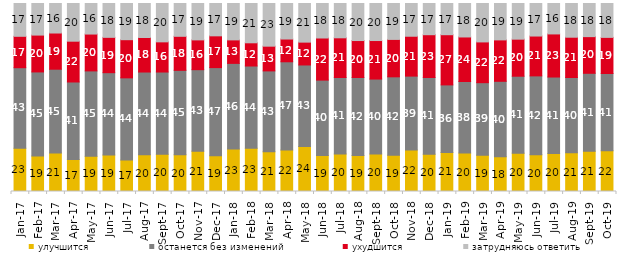
| Category | улучшится | останется без изменений | ухудшится | затрудняюсь ответить |
|---|---|---|---|---|
| 2017-01-01 | 23 | 42.85 | 16.7 | 17.45 |
| 2017-02-01 | 18.85 | 44.75 | 19.6 | 16.8 |
| 2017-03-01 | 20.5 | 44.55 | 19.25 | 15.7 |
| 2017-04-01 | 17 | 41.25 | 21.7 | 20.05 |
| 2017-05-01 | 18.7 | 45.45 | 19.6 | 16.25 |
| 2017-06-01 | 19.4 | 43.8 | 18.8 | 18 |
| 2017-07-01 | 16.7 | 43.75 | 20.3 | 19.25 |
| 2017-08-01 | 19.5 | 44.05 | 18.35 | 18.1 |
| 2017-09-01 | 19.8 | 43.75 | 16.05 | 20.4 |
| 2017-10-01 | 19.55 | 44.9 | 18.1 | 17.45 |
| 2017-11-01 | 21.45 | 43.35 | 15.85 | 19.35 |
| 2017-12-01 | 18.95 | 46.95 | 16.9 | 17.2 |
| 2018-01-01 | 22.55 | 45.6 | 12.5 | 19.35 |
| 2018-02-01 | 23 | 43.75 | 12.35 | 20.9 |
| 2018-03-01 | 21.15 | 43 | 13.15 | 22.7 |
| 2018-04-01 | 22.05 | 46.95 | 12.1 | 18.9 |
| 2018-05-01 | 23.95 | 43.35 | 12.15 | 20.55 |
| 2018-06-01 | 19.15 | 40.1 | 22.4 | 18.35 |
| 2018-07-01 | 19.95 | 40.7 | 21.1 | 18.25 |
| 2018-08-01 | 19.15 | 41.5 | 19.65 | 19.7 |
| 2018-09-01 | 19.95 | 39.85 | 20.5 | 19.7 |
| 2018-10-01 | 19.3 | 41.7 | 19.9 | 19.1 |
| 2018-11-01 | 22.056 | 39.321 | 21.208 | 17.415 |
| 2018-12-01 | 19.8 | 40.85 | 22.75 | 16.6 |
| 2019-01-01 | 20.75 | 35.95 | 26.7 | 16.6 |
| 2019-02-01 | 20.45 | 38.05 | 23.7 | 17.8 |
| 2019-03-01 | 19.344 | 38.538 | 21.681 | 20.438 |
| 2019-04-01 | 18.465 | 40.149 | 22.03 | 19.356 |
| 2019-05-01 | 20.406 | 40.911 | 19.713 | 18.97 |
| 2019-06-01 | 19.601 | 41.895 | 21.197 | 17.307 |
| 2019-07-01 | 20.149 | 40.743 | 22.921 | 16.188 |
| 2019-08-01 | 20.579 | 40.06 | 21.429 | 17.932 |
| 2019-09-01 | 21.386 | 41.485 | 19.505 | 17.624 |
| 2019-10-01 | 21.683 | 41.089 | 19.208 | 18.02 |